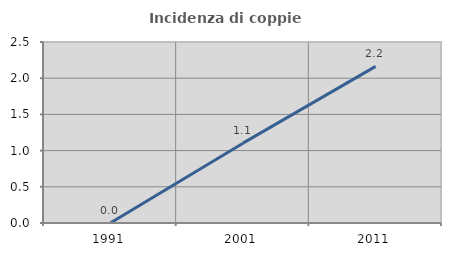
| Category | Incidenza di coppie miste |
|---|---|
| 1991.0 | 0 |
| 2001.0 | 1.103 |
| 2011.0 | 2.163 |